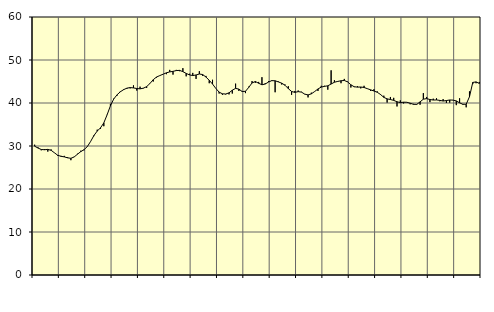
| Category | Piggar | Series 1 |
|---|---|---|
| nan | 30.3 | 29.95 |
| 87.0 | 29.7 | 29.53 |
| 87.0 | 29 | 29.19 |
| 87.0 | 29.3 | 29.13 |
| nan | 28.7 | 29.21 |
| 88.0 | 29.2 | 29 |
| 88.0 | 28.4 | 28.42 |
| 88.0 | 27.7 | 27.85 |
| nan | 27.7 | 27.6 |
| 89.0 | 27.7 | 27.47 |
| 89.0 | 27.4 | 27.25 |
| 89.0 | 26.7 | 27.14 |
| nan | 27.5 | 27.45 |
| 90.0 | 28.2 | 28.09 |
| 90.0 | 28.9 | 28.69 |
| 90.0 | 29 | 29.15 |
| nan | 29.8 | 29.87 |
| 91.0 | 31.1 | 31.07 |
| 91.0 | 32.3 | 32.44 |
| 91.0 | 33.8 | 33.48 |
| nan | 34 | 34.22 |
| 92.0 | 34.6 | 35.38 |
| 92.0 | 37.2 | 37.26 |
| 92.0 | 39.8 | 39.34 |
| nan | 41 | 40.92 |
| 93.0 | 41.7 | 41.9 |
| 93.0 | 42.7 | 42.6 |
| 93.0 | 43.2 | 43.1 |
| nan | 43.3 | 43.45 |
| 94.0 | 43.4 | 43.59 |
| 94.0 | 44.1 | 43.51 |
| 94.0 | 42.9 | 43.37 |
| nan | 43.8 | 43.29 |
| 95.0 | 43.5 | 43.44 |
| 95.0 | 43.5 | 43.81 |
| 95.0 | 44.6 | 44.54 |
| nan | 45 | 45.42 |
| 96.0 | 45.9 | 46.04 |
| 96.0 | 46.4 | 46.38 |
| 96.0 | 46.7 | 46.7 |
| nan | 46.7 | 47.02 |
| 97.0 | 47.7 | 47.23 |
| 97.0 | 46.6 | 47.36 |
| 97.0 | 47.7 | 47.54 |
| nan | 47.4 | 47.59 |
| 98.0 | 48.1 | 47.29 |
| 98.0 | 46.2 | 46.88 |
| 98.0 | 46.8 | 46.54 |
| nan | 47 | 46.38 |
| 99.0 | 45.6 | 46.52 |
| 99.0 | 47.4 | 46.74 |
| 99.0 | 46.3 | 46.62 |
| nan | 46.3 | 46.04 |
| 0.0 | 44.6 | 45.27 |
| 0.0 | 45.4 | 44.41 |
| 0.0 | 43.4 | 43.39 |
| nan | 42.2 | 42.53 |
| 1.0 | 41.9 | 42.14 |
| 1.0 | 42 | 42.09 |
| 1.0 | 42 | 42.36 |
| nan | 42.2 | 42.97 |
| 2.0 | 44.5 | 43.4 |
| 2.0 | 42.8 | 43.23 |
| 2.0 | 42.8 | 42.67 |
| nan | 42.3 | 42.72 |
| 3.0 | 43.8 | 43.64 |
| 3.0 | 45.1 | 44.66 |
| 3.0 | 44.7 | 45 |
| nan | 44.9 | 44.59 |
| 4.0 | 46 | 44.24 |
| 4.0 | 44.6 | 44.41 |
| 4.0 | 45.1 | 44.88 |
| nan | 45.3 | 45.2 |
| 5.0 | 42.5 | 45.17 |
| 5.0 | 45 | 44.9 |
| 5.0 | 44.3 | 44.61 |
| nan | 44.3 | 44.13 |
| 6.0 | 43.9 | 43.35 |
| 6.0 | 41.9 | 42.68 |
| 6.0 | 42.8 | 42.47 |
| nan | 42.9 | 42.64 |
| 7.0 | 42.6 | 42.53 |
| 7.0 | 42.1 | 42.06 |
| 7.0 | 41.3 | 41.88 |
| nan | 42.4 | 42.13 |
| 8.0 | 42.7 | 42.67 |
| 8.0 | 42.8 | 43.26 |
| 8.0 | 44 | 43.7 |
| nan | 44 | 43.87 |
| 9.0 | 43.1 | 44 |
| 9.0 | 47.6 | 44.41 |
| 9.0 | 45.3 | 44.83 |
| nan | 45.1 | 45.02 |
| 10.0 | 44.6 | 45.17 |
| 10.0 | 45.6 | 45.24 |
| 10.0 | 45 | 44.91 |
| nan | 43.6 | 44.24 |
| 11.0 | 43.7 | 43.78 |
| 11.0 | 43.9 | 43.69 |
| 11.0 | 43.4 | 43.72 |
| nan | 44 | 43.61 |
| 12.0 | 43.3 | 43.33 |
| 12.0 | 42.8 | 43.06 |
| 12.0 | 43.2 | 42.79 |
| nan | 42.7 | 42.5 |
| 13.0 | 41.9 | 41.98 |
| 13.0 | 41.7 | 41.31 |
| 13.0 | 40.1 | 40.96 |
| nan | 41.4 | 40.81 |
| 14.0 | 41.2 | 40.61 |
| 14.0 | 39.2 | 40.29 |
| 14.0 | 40.6 | 40.09 |
| nan | 39.9 | 40.19 |
| 15.0 | 40.2 | 40.17 |
| 15.0 | 39.7 | 39.95 |
| 15.0 | 39.8 | 39.69 |
| nan | 39.6 | 39.68 |
| 16.0 | 39.6 | 40.26 |
| 16.0 | 42.3 | 40.89 |
| 16.0 | 41.4 | 41.02 |
| nan | 40.2 | 40.81 |
| 17.0 | 41 | 40.69 |
| 17.0 | 41.1 | 40.71 |
| 17.0 | 40.4 | 40.61 |
| nan | 40.9 | 40.46 |
| 18.0 | 40 | 40.57 |
| 18.0 | 40.1 | 40.7 |
| 18.0 | 40.7 | 40.67 |
| nan | 39.5 | 40.49 |
| 19.0 | 41.1 | 40.03 |
| 19.0 | 39.6 | 39.7 |
| 19.0 | 39 | 39.71 |
| nan | 42.7 | 41.45 |
| 20.0 | 44.4 | 44.78 |
| 20.0 | 44.6 | 44.91 |
| 20.0 | 44.9 | 44.54 |